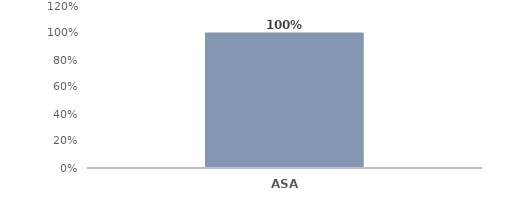
| Category | Total |
|---|---|
| ASA | 1 |